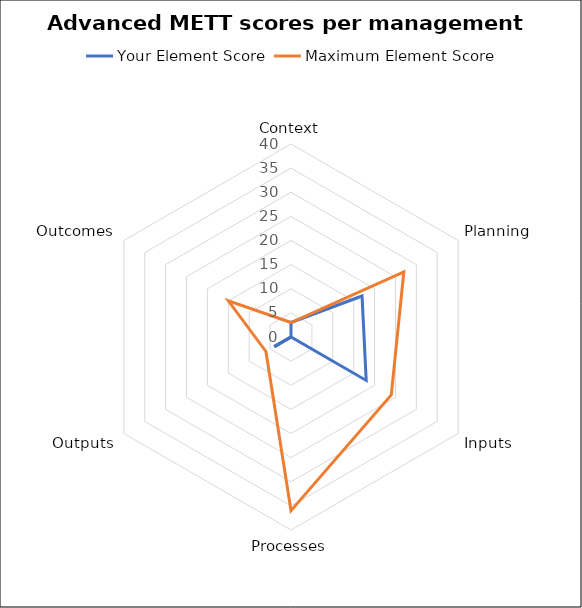
| Category | Your Element Score | Maximum Element Score |
|---|---|---|
| Context | 3 | 3 |
| Planning | 17 | 27 |
| Inputs | 18 | 24 |
| Processes | 0 | 36 |
| Outputs | 4 | 6 |
| Outcomes | 0 | 15 |